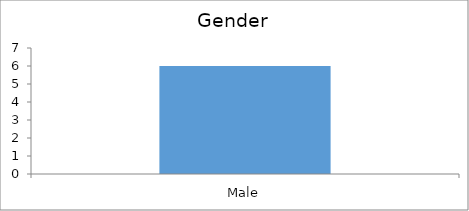
| Category | Gender |
|---|---|
| Male | 6 |